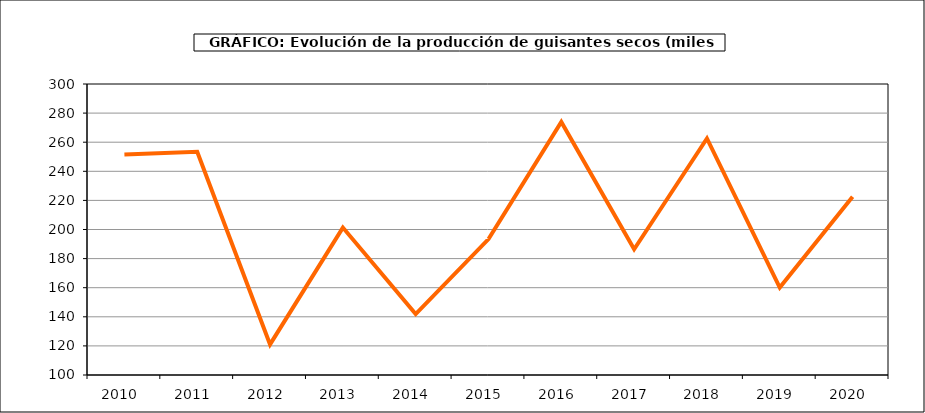
| Category | Producción |
|---|---|
| 2010.0 | 251.575 |
| 2011.0 | 253.427 |
| 2012.0 | 121.017 |
| 2013.0 | 201.326 |
| 2014.0 | 141.855 |
| 2015.0 | 193.389 |
| 2016.0 | 273.954 |
| 2017.0 | 186.406 |
| 2018.0 | 262.567 |
| 2019.0 | 160.115 |
| 2020.0 | 222.459 |